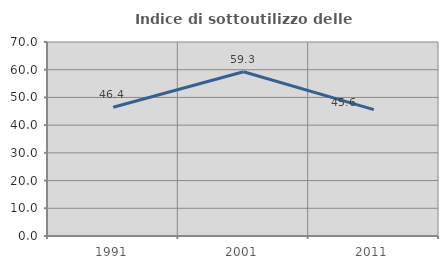
| Category | Indice di sottoutilizzo delle abitazioni  |
|---|---|
| 1991.0 | 46.447 |
| 2001.0 | 59.283 |
| 2011.0 | 45.594 |